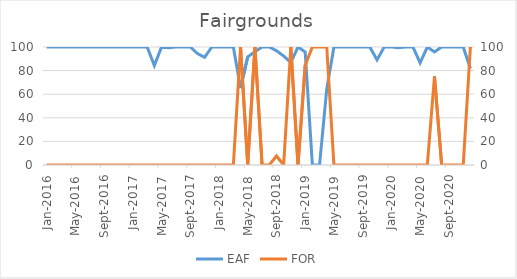
| Category | EAF |
|---|---|
| 2016-01-01 | 100 |
| 2016-02-01 | 100 |
| 2016-03-01 | 100 |
| 2016-04-01 | 100 |
| 2016-05-01 | 100 |
| 2016-06-01 | 100 |
| 2016-07-01 | 100 |
| 2016-08-01 | 100 |
| 2016-09-01 | 100 |
| 2016-10-01 | 100 |
| 2016-11-01 | 100 |
| 2016-12-01 | 100 |
| 2017-01-01 | 100 |
| 2017-02-01 | 100 |
| 2017-03-01 | 100 |
| 2017-04-01 | 84.31 |
| 2017-05-01 | 100 |
| 2017-06-01 | 99.39 |
| 2017-07-01 | 100 |
| 2017-08-01 | 100 |
| 2017-09-01 | 100 |
| 2017-10-01 | 94.49 |
| 2017-11-01 | 91.25 |
| 2017-12-01 | 100 |
| 2018-01-01 | 100 |
| 2018-02-01 | 100 |
| 2018-03-01 | 100 |
| 2018-04-01 | 65.23 |
| 2018-05-01 | 91.63 |
| 2018-06-01 | 95.98 |
| 2018-07-01 | 100 |
| 2018-08-01 | 100 |
| 2018-09-01 | 96.91 |
| 2018-10-01 | 92.35 |
| 2018-11-01 | 86.82 |
| 2018-12-01 | 100 |
| 2019-01-01 | 95.74 |
| 2019-02-01 | 0 |
| 2019-03-01 | 0 |
| 2019-04-01 | 64.29 |
| 2019-05-01 | 100 |
| 2019-06-01 | 100 |
| 2019-07-01 | 100 |
| 2019-08-01 | 100 |
| 2019-09-01 | 100 |
| 2019-10-01 | 100 |
| 2019-11-01 | 89.08 |
| 2019-12-01 | 100 |
| 2020-01-01 | 100 |
| 2020-02-01 | 99.43 |
| 2020-03-01 | 100 |
| 2020-04-01 | 100 |
| 2020-05-01 | 86.56 |
| 2020-06-01 | 100 |
| 2020-07-01 | 95.84 |
| 2020-08-01 | 100 |
| 2020-09-01 | 100 |
| 2020-10-01 | 100 |
| 2020-11-01 | 100 |
| 2020-12-01 | 81.8 |